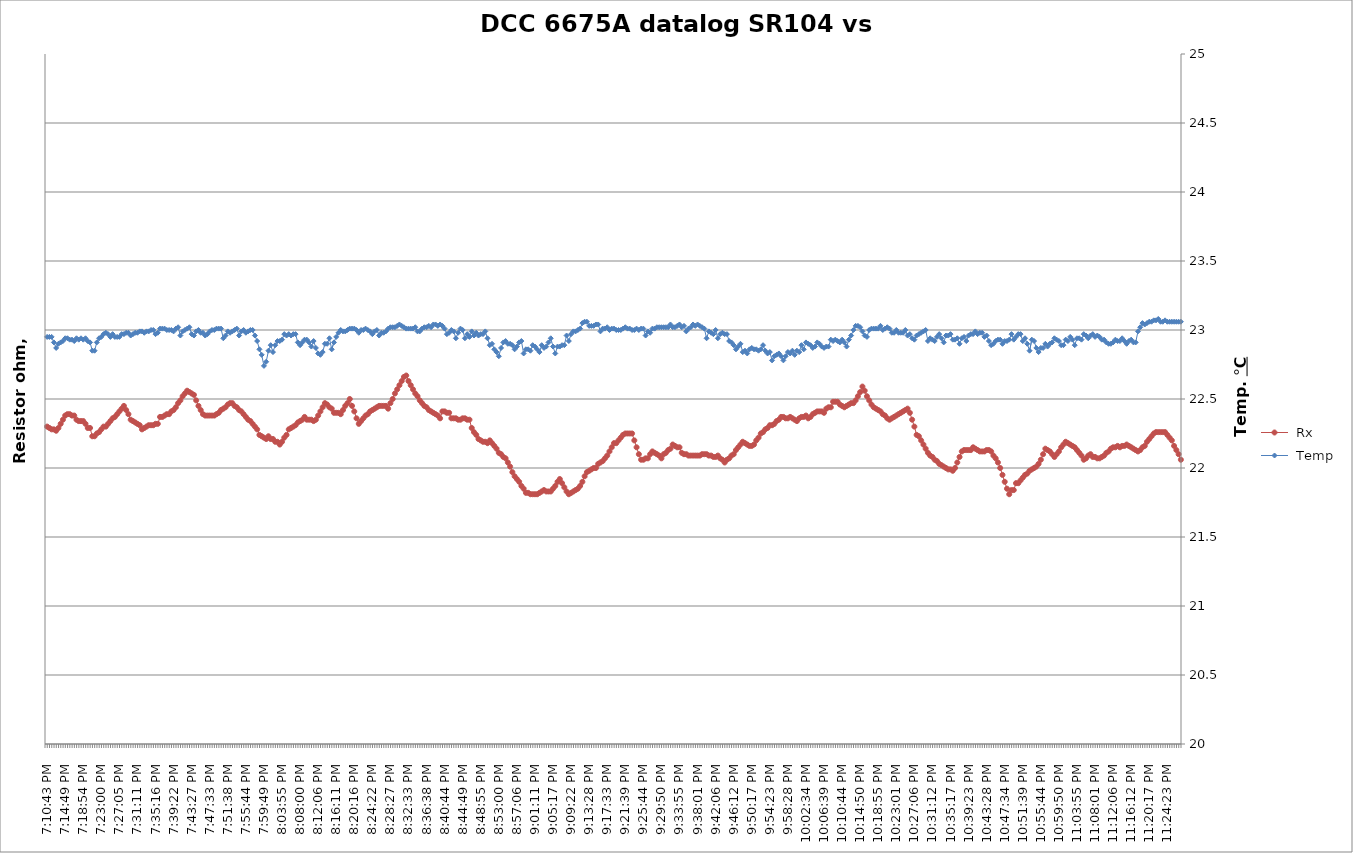
| Category |  Rx |
|---|---|
| 2021-03-05 19:10:43 | 10000.16 |
| 2021-03-05 19:11:14 | 10000.16 |
| 2021-03-05 19:11:45 | 10000.16 |
| 2021-03-05 19:12:15 | 10000.16 |
| 2021-03-05 19:12:46 | 10000.16 |
| 2021-03-05 19:13:17 | 10000.16 |
| 2021-03-05 19:13:47 | 10000.16 |
| 2021-03-05 19:14:18 | 10000.16 |
| 2021-03-05 19:14:49 | 10000.16 |
| 2021-03-05 19:15:19 | 10000.16 |
| 2021-03-05 19:15:50 | 10000.16 |
| 2021-03-05 19:16:21 | 10000.16 |
| 2021-03-05 19:16:52 | 10000.16 |
| 2021-03-05 19:17:22 | 10000.16 |
| 2021-03-05 19:17:53 | 10000.16 |
| 2021-03-05 19:18:24 | 10000.16 |
| 2021-03-05 19:18:54 | 10000.16 |
| 2021-03-05 19:19:25 | 10000.16 |
| 2021-03-05 19:19:56 | 10000.16 |
| 2021-03-05 19:20:26 | 10000.16 |
| 2021-03-05 19:20:57 | 10000.16 |
| 2021-03-05 19:21:28 | 10000.16 |
| 2021-03-05 19:21:58 | 10000.16 |
| 2021-03-05 19:22:29 | 10000.16 |
| 2021-03-05 19:23:00 | 10000.16 |
| 2021-03-05 19:23:30 | 10000.16 |
| 2021-03-05 19:24:01 | 10000.16 |
| 2021-03-05 19:24:32 | 10000.16 |
| 2021-03-05 19:25:02 | 10000.16 |
| 2021-03-05 19:25:33 | 10000.16 |
| 2021-03-05 19:26:04 | 10000.16 |
| 2021-03-05 19:26:35 | 10000.16 |
| 2021-03-05 19:27:05 | 10000.16 |
| 2021-03-05 19:27:36 | 10000.16 |
| 2021-03-05 19:28:07 | 10000.16 |
| 2021-03-05 19:28:37 | 10000.16 |
| 2021-03-05 19:29:08 | 10000.16 |
| 2021-03-05 19:29:39 | 10000.16 |
| 2021-03-05 19:30:09 | 10000.16 |
| 2021-03-05 19:30:40 | 10000.16 |
| 2021-03-05 19:31:11 | 10000.16 |
| 2021-03-05 19:31:41 | 10000.16 |
| 2021-03-05 19:32:12 | 10000.16 |
| 2021-03-05 19:32:43 | 10000.16 |
| 2021-03-05 19:33:13 | 10000.16 |
| 2021-03-05 19:33:44 | 10000.16 |
| 2021-03-05 19:34:15 | 10000.16 |
| 2021-03-05 19:34:45 | 10000.16 |
| 2021-03-05 19:35:16 | 10000.16 |
| 2021-03-05 19:35:47 | 10000.16 |
| 2021-03-05 19:36:18 | 10000.16 |
| 2021-03-05 19:36:48 | 10000.16 |
| 2021-03-05 19:37:19 | 10000.16 |
| 2021-03-05 19:37:50 | 10000.16 |
| 2021-03-05 19:38:20 | 10000.16 |
| 2021-03-05 19:38:51 | 10000.16 |
| 2021-03-05 19:39:22 | 10000.16 |
| 2021-03-05 19:39:52 | 10000.16 |
| 2021-03-05 19:40:23 | 10000.16 |
| 2021-03-05 19:40:54 | 10000.16 |
| 2021-03-05 19:41:24 | 10000.161 |
| 2021-03-05 19:41:55 | 10000.161 |
| 2021-03-05 19:42:26 | 10000.161 |
| 2021-03-05 19:42:56 | 10000.161 |
| 2021-03-05 19:43:27 | 10000.161 |
| 2021-03-05 19:43:58 | 10000.161 |
| 2021-03-05 19:44:28 | 10000.16 |
| 2021-03-05 19:44:59 | 10000.16 |
| 2021-03-05 19:45:30 | 10000.16 |
| 2021-03-05 19:46:01 | 10000.16 |
| 2021-03-05 19:46:31 | 10000.16 |
| 2021-03-05 19:47:02 | 10000.16 |
| 2021-03-05 19:47:33 | 10000.16 |
| 2021-03-05 19:48:03 | 10000.16 |
| 2021-03-05 19:48:34 | 10000.16 |
| 2021-03-05 19:49:05 | 10000.16 |
| 2021-03-05 19:49:35 | 10000.16 |
| 2021-03-05 19:50:06 | 10000.16 |
| 2021-03-05 19:50:37 | 10000.16 |
| 2021-03-05 19:51:07 | 10000.16 |
| 2021-03-05 19:51:38 | 10000.16 |
| 2021-03-05 19:52:09 | 10000.16 |
| 2021-03-05 19:52:39 | 10000.16 |
| 2021-03-05 19:53:10 | 10000.16 |
| 2021-03-05 19:53:41 | 10000.16 |
| 2021-03-05 19:54:12 | 10000.16 |
| 2021-03-05 19:54:42 | 10000.16 |
| 2021-03-05 19:55:13 | 10000.16 |
| 2021-03-05 19:55:44 | 10000.16 |
| 2021-03-05 19:56:14 | 10000.16 |
| 2021-03-05 19:56:45 | 10000.16 |
| 2021-03-05 19:57:16 | 10000.16 |
| 2021-03-05 19:57:46 | 10000.16 |
| 2021-03-05 19:58:17 | 10000.16 |
| 2021-03-05 19:58:48 | 10000.16 |
| 2021-03-05 19:59:18 | 10000.16 |
| 2021-03-05 19:59:49 | 10000.16 |
| 2021-03-05 20:00:20 | 10000.16 |
| 2021-03-05 20:00:50 | 10000.16 |
| 2021-03-05 20:01:21 | 10000.16 |
| 2021-03-05 20:01:52 | 10000.16 |
| 2021-03-05 20:02:22 | 10000.16 |
| 2021-03-05 20:02:53 | 10000.16 |
| 2021-03-05 20:03:24 | 10000.16 |
| 2021-03-05 20:03:55 | 10000.16 |
| 2021-03-05 20:04:25 | 10000.16 |
| 2021-03-05 20:04:56 | 10000.16 |
| 2021-03-05 20:05:27 | 10000.16 |
| 2021-03-05 20:05:57 | 10000.16 |
| 2021-03-05 20:06:28 | 10000.16 |
| 2021-03-05 20:06:59 | 10000.16 |
| 2021-03-05 20:07:29 | 10000.16 |
| 2021-03-05 20:08:00 | 10000.16 |
| 2021-03-05 20:08:31 | 10000.16 |
| 2021-03-05 20:09:01 | 10000.16 |
| 2021-03-05 20:09:32 | 10000.16 |
| 2021-03-05 20:10:03 | 10000.16 |
| 2021-03-05 20:10:33 | 10000.16 |
| 2021-03-05 20:11:04 | 10000.16 |
| 2021-03-05 20:11:35 | 10000.16 |
| 2021-03-05 20:12:06 | 10000.16 |
| 2021-03-05 20:12:36 | 10000.16 |
| 2021-03-05 20:13:07 | 10000.16 |
| 2021-03-05 20:13:38 | 10000.16 |
| 2021-03-05 20:14:08 | 10000.16 |
| 2021-03-05 20:14:39 | 10000.16 |
| 2021-03-05 20:15:10 | 10000.16 |
| 2021-03-05 20:15:40 | 10000.16 |
| 2021-03-05 20:16:11 | 10000.16 |
| 2021-03-05 20:16:42 | 10000.16 |
| 2021-03-05 20:17:12 | 10000.16 |
| 2021-03-05 20:17:43 | 10000.16 |
| 2021-03-05 20:18:14 | 10000.16 |
| 2021-03-05 20:18:44 | 10000.16 |
| 2021-03-05 20:19:15 | 10000.16 |
| 2021-03-05 20:19:46 | 10000.16 |
| 2021-03-05 20:20:16 | 10000.16 |
| 2021-03-05 20:20:47 | 10000.16 |
| 2021-03-05 20:21:18 | 10000.16 |
| 2021-03-05 20:21:49 | 10000.16 |
| 2021-03-05 20:22:19 | 10000.16 |
| 2021-03-05 20:22:50 | 10000.16 |
| 2021-03-05 20:23:21 | 10000.16 |
| 2021-03-05 20:23:51 | 10000.16 |
| 2021-03-05 20:24:22 | 10000.16 |
| 2021-03-05 20:24:53 | 10000.16 |
| 2021-03-05 20:25:23 | 10000.16 |
| 2021-03-05 20:25:54 | 10000.16 |
| 2021-03-05 20:26:25 | 10000.16 |
| 2021-03-05 20:26:55 | 10000.16 |
| 2021-03-05 20:27:26 | 10000.16 |
| 2021-03-05 20:27:57 | 10000.16 |
| 2021-03-05 20:28:27 | 10000.16 |
| 2021-03-05 20:28:58 | 10000.16 |
| 2021-03-05 20:29:29 | 10000.161 |
| 2021-03-05 20:30:00 | 10000.161 |
| 2021-03-05 20:30:30 | 10000.161 |
| 2021-03-05 20:31:01 | 10000.161 |
| 2021-03-05 20:31:32 | 10000.161 |
| 2021-03-05 20:32:02 | 10000.161 |
| 2021-03-05 20:32:33 | 10000.161 |
| 2021-03-05 20:33:04 | 10000.161 |
| 2021-03-05 20:33:34 | 10000.161 |
| 2021-03-05 20:34:05 | 10000.161 |
| 2021-03-05 20:34:36 | 10000.161 |
| 2021-03-05 20:35:06 | 10000.16 |
| 2021-03-05 20:35:37 | 10000.16 |
| 2021-03-05 20:36:08 | 10000.16 |
| 2021-03-05 20:36:38 | 10000.16 |
| 2021-03-05 20:37:09 | 10000.16 |
| 2021-03-05 20:37:40 | 10000.16 |
| 2021-03-05 20:38:11 | 10000.16 |
| 2021-03-05 20:38:41 | 10000.16 |
| 2021-03-05 20:39:12 | 10000.16 |
| 2021-03-05 20:39:43 | 10000.16 |
| 2021-03-05 20:40:13 | 10000.16 |
| 2021-03-05 20:40:44 | 10000.16 |
| 2021-03-05 20:41:15 | 10000.16 |
| 2021-03-05 20:41:45 | 10000.16 |
| 2021-03-05 20:42:16 | 10000.16 |
| 2021-03-05 20:42:47 | 10000.16 |
| 2021-03-05 20:43:17 | 10000.16 |
| 2021-03-05 20:43:48 | 10000.16 |
| 2021-03-05 20:44:19 | 10000.16 |
| 2021-03-05 20:44:49 | 10000.16 |
| 2021-03-05 20:45:20 | 10000.16 |
| 2021-03-05 20:45:51 | 10000.16 |
| 2021-03-05 20:46:21 | 10000.16 |
| 2021-03-05 20:46:52 | 10000.16 |
| 2021-03-05 20:47:23 | 10000.16 |
| 2021-03-05 20:47:54 | 10000.16 |
| 2021-03-05 20:48:24 | 10000.16 |
| 2021-03-05 20:48:55 | 10000.16 |
| 2021-03-05 20:49:26 | 10000.16 |
| 2021-03-05 20:49:56 | 10000.16 |
| 2021-03-05 20:50:27 | 10000.16 |
| 2021-03-05 20:50:58 | 10000.16 |
| 2021-03-05 20:51:28 | 10000.16 |
| 2021-03-05 20:51:59 | 10000.16 |
| 2021-03-05 20:52:30 | 10000.16 |
| 2021-03-05 20:53:00 | 10000.16 |
| 2021-03-05 20:53:31 | 10000.16 |
| 2021-03-05 20:54:02 | 10000.16 |
| 2021-03-05 20:54:32 | 10000.16 |
| 2021-03-05 20:55:03 | 10000.16 |
| 2021-03-05 20:55:34 | 10000.16 |
| 2021-03-05 20:56:05 | 10000.16 |
| 2021-03-05 20:56:35 | 10000.16 |
| 2021-03-05 20:57:06 | 10000.16 |
| 2021-03-05 20:57:37 | 10000.16 |
| 2021-03-05 20:58:07 | 10000.16 |
| 2021-03-05 20:58:38 | 10000.16 |
| 2021-03-05 20:59:09 | 10000.16 |
| 2021-03-05 20:59:39 | 10000.16 |
| 2021-03-05 21:00:10 | 10000.16 |
| 2021-03-05 21:00:41 | 10000.16 |
| 2021-03-05 21:01:11 | 10000.16 |
| 2021-03-05 21:01:42 | 10000.16 |
| 2021-03-05 21:02:13 | 10000.16 |
| 2021-03-05 21:02:43 | 10000.16 |
| 2021-03-05 21:03:14 | 10000.16 |
| 2021-03-05 21:03:45 | 10000.16 |
| 2021-03-05 21:04:15 | 10000.16 |
| 2021-03-05 21:04:46 | 10000.16 |
| 2021-03-05 21:05:17 | 10000.16 |
| 2021-03-05 21:05:48 | 10000.16 |
| 2021-03-05 21:06:18 | 10000.16 |
| 2021-03-05 21:06:49 | 10000.16 |
| 2021-03-05 21:07:20 | 10000.16 |
| 2021-03-05 21:07:50 | 10000.16 |
| 2021-03-05 21:08:21 | 10000.16 |
| 2021-03-05 21:08:52 | 10000.16 |
| 2021-03-05 21:09:22 | 10000.16 |
| 2021-03-05 21:09:53 | 10000.16 |
| 2021-03-05 21:10:24 | 10000.16 |
| 2021-03-05 21:10:54 | 10000.16 |
| 2021-03-05 21:11:25 | 10000.16 |
| 2021-03-05 21:11:56 | 10000.16 |
| 2021-03-05 21:12:26 | 10000.16 |
| 2021-03-05 21:12:57 | 10000.16 |
| 2021-03-05 21:13:28 | 10000.16 |
| 2021-03-05 21:13:59 | 10000.16 |
| 2021-03-05 21:14:29 | 10000.16 |
| 2021-03-05 21:15:00 | 10000.16 |
| 2021-03-05 21:15:31 | 10000.16 |
| 2021-03-05 21:16:01 | 10000.16 |
| 2021-03-05 21:16:32 | 10000.16 |
| 2021-03-05 21:17:03 | 10000.16 |
| 2021-03-05 21:17:33 | 10000.16 |
| 2021-03-05 21:18:04 | 10000.16 |
| 2021-03-05 21:18:35 | 10000.16 |
| 2021-03-05 21:19:05 | 10000.16 |
| 2021-03-05 21:19:36 | 10000.16 |
| 2021-03-05 21:20:07 | 10000.16 |
| 2021-03-05 21:20:37 | 10000.16 |
| 2021-03-05 21:21:08 | 10000.16 |
| 2021-03-05 21:21:39 | 10000.16 |
| 2021-03-05 21:22:10 | 10000.16 |
| 2021-03-05 21:22:40 | 10000.16 |
| 2021-03-05 21:23:11 | 10000.16 |
| 2021-03-05 21:23:42 | 10000.16 |
| 2021-03-05 21:24:12 | 10000.16 |
| 2021-03-05 21:24:43 | 10000.16 |
| 2021-03-05 21:25:14 | 10000.16 |
| 2021-03-05 21:25:44 | 10000.16 |
| 2021-03-05 21:26:15 | 10000.16 |
| 2021-03-05 21:26:46 | 10000.16 |
| 2021-03-05 21:27:16 | 10000.16 |
| 2021-03-05 21:27:47 | 10000.16 |
| 2021-03-05 21:28:18 | 10000.16 |
| 2021-03-05 21:28:48 | 10000.16 |
| 2021-03-05 21:29:19 | 10000.16 |
| 2021-03-05 21:29:50 | 10000.16 |
| 2021-03-05 21:30:20 | 10000.16 |
| 2021-03-05 21:30:51 | 10000.16 |
| 2021-03-05 21:31:22 | 10000.16 |
| 2021-03-05 21:31:53 | 10000.16 |
| 2021-03-05 21:32:23 | 10000.16 |
| 2021-03-05 21:32:54 | 10000.16 |
| 2021-03-05 21:33:25 | 10000.16 |
| 2021-03-05 21:33:55 | 10000.16 |
| 2021-03-05 21:34:26 | 10000.16 |
| 2021-03-05 21:34:57 | 10000.16 |
| 2021-03-05 21:35:27 | 10000.16 |
| 2021-03-05 21:35:58 | 10000.16 |
| 2021-03-05 21:36:29 | 10000.16 |
| 2021-03-05 21:36:59 | 10000.16 |
| 2021-03-05 21:37:30 | 10000.16 |
| 2021-03-05 21:38:01 | 10000.16 |
| 2021-03-05 21:38:31 | 10000.16 |
| 2021-03-05 21:39:02 | 10000.16 |
| 2021-03-05 21:39:33 | 10000.16 |
| 2021-03-05 21:40:03 | 10000.16 |
| 2021-03-05 21:40:34 | 10000.16 |
| 2021-03-05 21:41:05 | 10000.16 |
| 2021-03-05 21:41:36 | 10000.16 |
| 2021-03-05 21:42:06 | 10000.16 |
| 2021-03-05 21:42:37 | 10000.16 |
| 2021-03-05 21:43:08 | 10000.16 |
| 2021-03-05 21:43:38 | 10000.16 |
| 2021-03-05 21:44:09 | 10000.16 |
| 2021-03-05 21:44:40 | 10000.16 |
| 2021-03-05 21:45:10 | 10000.16 |
| 2021-03-05 21:45:41 | 10000.16 |
| 2021-03-05 21:46:12 | 10000.16 |
| 2021-03-05 21:46:42 | 10000.16 |
| 2021-03-05 21:47:13 | 10000.16 |
| 2021-03-05 21:47:44 | 10000.16 |
| 2021-03-05 21:48:14 | 10000.16 |
| 2021-03-05 21:48:45 | 10000.16 |
| 2021-03-05 21:49:16 | 10000.16 |
| 2021-03-05 21:49:46 | 10000.16 |
| 2021-03-05 21:50:17 | 10000.16 |
| 2021-03-05 21:50:48 | 10000.16 |
| 2021-03-05 21:51:19 | 10000.16 |
| 2021-03-05 21:51:49 | 10000.16 |
| 2021-03-05 21:52:20 | 10000.16 |
| 2021-03-05 21:52:51 | 10000.16 |
| 2021-03-05 21:53:21 | 10000.16 |
| 2021-03-05 21:53:52 | 10000.16 |
| 2021-03-05 21:54:23 | 10000.16 |
| 2021-03-05 21:54:53 | 10000.16 |
| 2021-03-05 21:55:24 | 10000.16 |
| 2021-03-05 21:55:55 | 10000.16 |
| 2021-03-05 21:56:25 | 10000.16 |
| 2021-03-05 21:56:56 | 10000.16 |
| 2021-03-05 21:57:27 | 10000.16 |
| 2021-03-05 21:57:57 | 10000.16 |
| 2021-03-05 21:58:28 | 10000.16 |
| 2021-03-05 21:58:59 | 10000.16 |
| 2021-03-05 21:59:29 | 10000.16 |
| 2021-03-05 22:00:00 | 10000.16 |
| 2021-03-05 22:00:31 | 10000.16 |
| 2021-03-05 22:01:01 | 10000.16 |
| 2021-03-05 22:01:32 | 10000.16 |
| 2021-03-05 22:02:03 | 10000.16 |
| 2021-03-05 22:02:34 | 10000.16 |
| 2021-03-05 22:03:04 | 10000.16 |
| 2021-03-05 22:03:35 | 10000.16 |
| 2021-03-05 22:04:06 | 10000.16 |
| 2021-03-05 22:04:36 | 10000.16 |
| 2021-03-05 22:05:07 | 10000.16 |
| 2021-03-05 22:05:38 | 10000.16 |
| 2021-03-05 22:06:08 | 10000.16 |
| 2021-03-05 22:06:39 | 10000.16 |
| 2021-03-05 22:07:10 | 10000.16 |
| 2021-03-05 22:07:40 | 10000.16 |
| 2021-03-05 22:08:11 | 10000.16 |
| 2021-03-05 22:08:42 | 10000.16 |
| 2021-03-05 22:09:12 | 10000.16 |
| 2021-03-05 22:09:43 | 10000.16 |
| 2021-03-05 22:10:14 | 10000.16 |
| 2021-03-05 22:10:44 | 10000.16 |
| 2021-03-05 22:11:15 | 10000.16 |
| 2021-03-05 22:11:46 | 10000.16 |
| 2021-03-05 22:12:17 | 10000.16 |
| 2021-03-05 22:12:47 | 10000.16 |
| 2021-03-05 22:13:18 | 10000.16 |
| 2021-03-05 22:13:49 | 10000.16 |
| 2021-03-05 22:14:19 | 10000.161 |
| 2021-03-05 22:14:50 | 10000.161 |
| 2021-03-05 22:15:21 | 10000.161 |
| 2021-03-05 22:15:51 | 10000.161 |
| 2021-03-05 22:16:22 | 10000.161 |
| 2021-03-05 22:16:53 | 10000.16 |
| 2021-03-05 22:17:23 | 10000.16 |
| 2021-03-05 22:17:54 | 10000.16 |
| 2021-03-05 22:18:25 | 10000.16 |
| 2021-03-05 22:18:55 | 10000.16 |
| 2021-03-05 22:19:26 | 10000.16 |
| 2021-03-05 22:19:57 | 10000.16 |
| 2021-03-05 22:20:27 | 10000.16 |
| 2021-03-05 22:20:58 | 10000.16 |
| 2021-03-05 22:21:29 | 10000.16 |
| 2021-03-05 22:21:59 | 10000.16 |
| 2021-03-05 22:22:30 | 10000.16 |
| 2021-03-05 22:23:01 | 10000.16 |
| 2021-03-05 22:23:32 | 10000.16 |
| 2021-03-05 22:24:02 | 10000.16 |
| 2021-03-05 22:24:33 | 10000.16 |
| 2021-03-05 22:25:04 | 10000.16 |
| 2021-03-05 22:25:34 | 10000.16 |
| 2021-03-05 22:26:05 | 10000.16 |
| 2021-03-05 22:26:36 | 10000.16 |
| 2021-03-05 22:27:06 | 10000.16 |
| 2021-03-05 22:27:37 | 10000.16 |
| 2021-03-05 22:28:08 | 10000.16 |
| 2021-03-05 22:28:38 | 10000.16 |
| 2021-03-05 22:29:09 | 10000.16 |
| 2021-03-05 22:29:40 | 10000.16 |
| 2021-03-05 22:30:10 | 10000.16 |
| 2021-03-05 22:30:41 | 10000.16 |
| 2021-03-05 22:31:12 | 10000.16 |
| 2021-03-05 22:31:42 | 10000.16 |
| 2021-03-05 22:32:13 | 10000.16 |
| 2021-03-05 22:32:44 | 10000.16 |
| 2021-03-05 22:33:14 | 10000.16 |
| 2021-03-05 22:33:45 | 10000.16 |
| 2021-03-05 22:34:16 | 10000.16 |
| 2021-03-05 22:34:47 | 10000.16 |
| 2021-03-05 22:35:17 | 10000.16 |
| 2021-03-05 22:35:48 | 10000.16 |
| 2021-03-05 22:36:19 | 10000.16 |
| 2021-03-05 22:36:49 | 10000.16 |
| 2021-03-05 22:37:20 | 10000.16 |
| 2021-03-05 22:37:51 | 10000.16 |
| 2021-03-05 22:38:21 | 10000.16 |
| 2021-03-05 22:38:52 | 10000.16 |
| 2021-03-05 22:39:23 | 10000.16 |
| 2021-03-05 22:39:53 | 10000.16 |
| 2021-03-05 22:40:24 | 10000.16 |
| 2021-03-05 22:40:55 | 10000.16 |
| 2021-03-05 22:41:25 | 10000.16 |
| 2021-03-05 22:41:56 | 10000.16 |
| 2021-03-05 22:42:27 | 10000.16 |
| 2021-03-05 22:42:57 | 10000.16 |
| 2021-03-05 22:43:28 | 10000.16 |
| 2021-03-05 22:43:59 | 10000.16 |
| 2021-03-05 22:44:29 | 10000.16 |
| 2021-03-05 22:45:00 | 10000.16 |
| 2021-03-05 22:45:31 | 10000.16 |
| 2021-03-05 22:46:02 | 10000.16 |
| 2021-03-05 22:46:32 | 10000.16 |
| 2021-03-05 22:47:03 | 10000.16 |
| 2021-03-05 22:47:34 | 10000.16 |
| 2021-03-05 22:48:04 | 10000.16 |
| 2021-03-05 22:48:35 | 10000.16 |
| 2021-03-05 22:49:06 | 10000.16 |
| 2021-03-05 22:49:36 | 10000.16 |
| 2021-03-05 22:50:07 | 10000.16 |
| 2021-03-05 22:50:38 | 10000.16 |
| 2021-03-05 22:51:08 | 10000.16 |
| 2021-03-05 22:51:39 | 10000.16 |
| 2021-03-05 22:52:10 | 10000.16 |
| 2021-03-05 22:52:40 | 10000.16 |
| 2021-03-05 22:53:11 | 10000.16 |
| 2021-03-05 22:53:42 | 10000.16 |
| 2021-03-05 22:54:12 | 10000.16 |
| 2021-03-05 22:54:43 | 10000.16 |
| 2021-03-05 22:55:14 | 10000.16 |
| 2021-03-05 22:55:44 | 10000.16 |
| 2021-03-05 22:56:15 | 10000.16 |
| 2021-03-05 22:56:46 | 10000.16 |
| 2021-03-05 22:57:17 | 10000.16 |
| 2021-03-05 22:57:47 | 10000.16 |
| 2021-03-05 22:58:18 | 10000.16 |
| 2021-03-05 22:58:49 | 10000.16 |
| 2021-03-05 22:59:19 | 10000.16 |
| 2021-03-05 22:59:50 | 10000.16 |
| 2021-03-05 23:00:21 | 10000.16 |
| 2021-03-05 23:00:51 | 10000.16 |
| 2021-03-05 23:01:22 | 10000.16 |
| 2021-03-05 23:01:53 | 10000.16 |
| 2021-03-05 23:02:23 | 10000.16 |
| 2021-03-05 23:02:54 | 10000.16 |
| 2021-03-05 23:03:25 | 10000.16 |
| 2021-03-05 23:03:55 | 10000.16 |
| 2021-03-05 23:04:26 | 10000.16 |
| 2021-03-05 23:04:57 | 10000.16 |
| 2021-03-05 23:05:27 | 10000.16 |
| 2021-03-05 23:05:58 | 10000.16 |
| 2021-03-05 23:06:29 | 10000.16 |
| 2021-03-05 23:06:59 | 10000.16 |
| 2021-03-05 23:07:30 | 10000.16 |
| 2021-03-05 23:08:01 | 10000.16 |
| 2021-03-05 23:08:32 | 10000.16 |
| 2021-03-05 23:09:02 | 10000.16 |
| 2021-03-05 23:09:33 | 10000.16 |
| 2021-03-05 23:10:04 | 10000.16 |
| 2021-03-05 23:10:34 | 10000.16 |
| 2021-03-05 23:11:05 | 10000.16 |
| 2021-03-05 23:11:36 | 10000.16 |
| 2021-03-05 23:12:06 | 10000.16 |
| 2021-03-05 23:12:37 | 10000.16 |
| 2021-03-05 23:13:08 | 10000.16 |
| 2021-03-05 23:13:38 | 10000.16 |
| 2021-03-05 23:14:09 | 10000.16 |
| 2021-03-05 23:14:40 | 10000.16 |
| 2021-03-05 23:15:10 | 10000.16 |
| 2021-03-05 23:15:41 | 10000.16 |
| 2021-03-05 23:16:12 | 10000.16 |
| 2021-03-05 23:16:42 | 10000.16 |
| 2021-03-05 23:17:13 | 10000.16 |
| 2021-03-05 23:17:44 | 10000.16 |
| 2021-03-05 23:18:14 | 10000.16 |
| 2021-03-05 23:18:45 | 10000.16 |
| 2021-03-05 23:19:16 | 10000.16 |
| 2021-03-05 23:19:47 | 10000.16 |
| 2021-03-05 23:20:17 | 10000.16 |
| 2021-03-05 23:20:48 | 10000.16 |
| 2021-03-05 23:21:19 | 10000.16 |
| 2021-03-05 23:21:49 | 10000.16 |
| 2021-03-05 23:22:20 | 10000.16 |
| 2021-03-05 23:22:51 | 10000.16 |
| 2021-03-05 23:23:21 | 10000.16 |
| 2021-03-05 23:23:52 | 10000.16 |
| 2021-03-05 23:24:23 | 10000.16 |
| 2021-03-05 23:24:53 | 10000.16 |
| 2021-03-05 23:25:24 | 10000.16 |
| 2021-03-05 23:25:55 | 10000.16 |
| 2021-03-05 23:26:25 | 10000.16 |
| 2021-03-05 23:26:56 | 10000.16 |
| 2021-03-05 23:27:27 | 10000.16 |